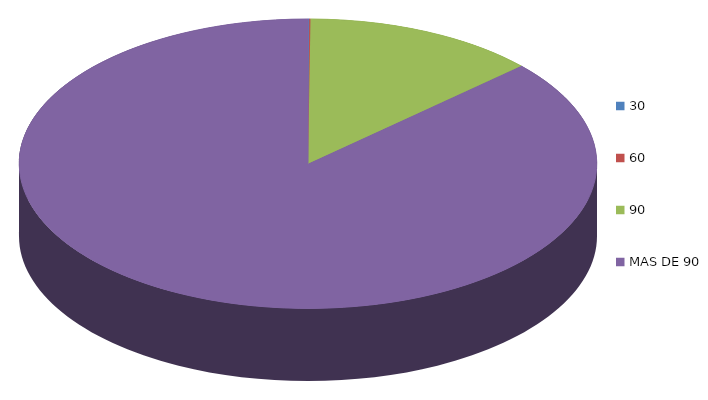
| Category | Series 0 | 47,334.3 |
|---|---|---|
| 0 | 47334.3 |  |
| 1 | 49023.8 |  |
| 2 | 9180112.3 |  |
| 3 | 60986967.6 |  |